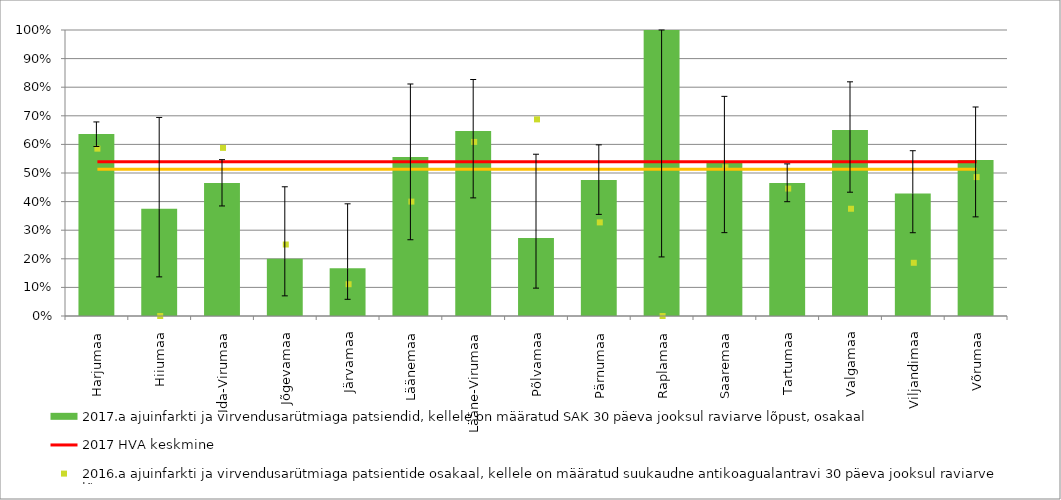
| Category | 2017.a ajuinfarkti ja virvendusarütmiaga patsiendid, kellele on määratud SAK 30 päeva jooksul raviarve lõpust, osakaal |
|---|---|
| Harjumaa | 0.637 |
| Hiiumaa | 0.375 |
| Ida-Virumaa | 0.465 |
| Jõgevamaa | 0.2 |
| Järvamaa | 0.167 |
| Läänemaa | 0.556 |
| Lääne-Virumaa | 0.647 |
| Põlvamaa | 0.273 |
| Pärnumaa | 0.475 |
| Raplamaa | 1 |
| Saaremaa | 0.538 |
| Tartumaa | 0.465 |
| Valgamaa | 0.65 |
| Viljandimaa | 0.429 |
| Võrumaa | 0.545 |